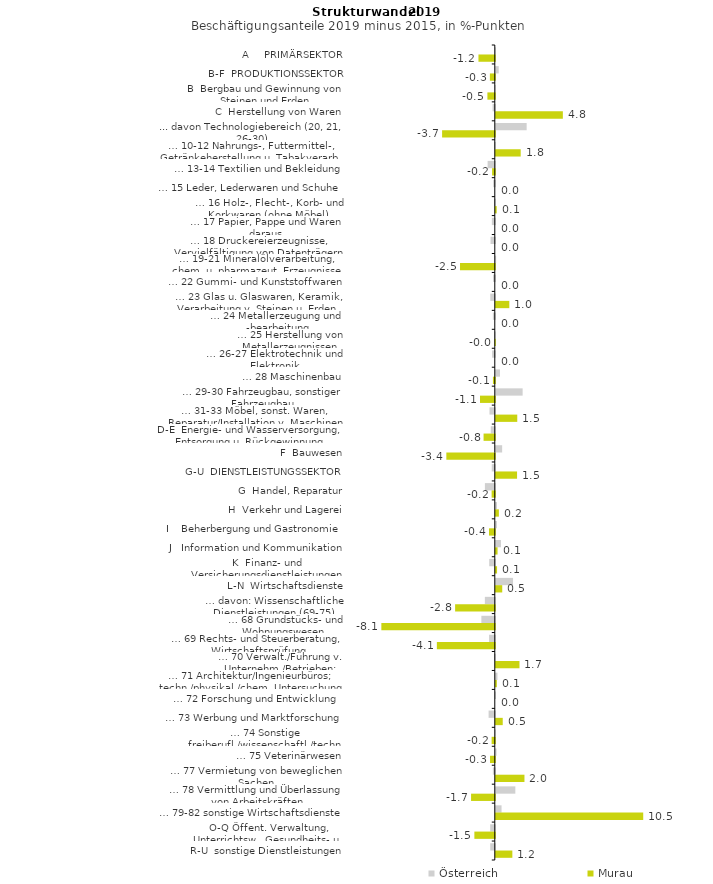
| Category | Österreich | Murau |
|---|---|---|
| A     PRIMÄRSEKTOR | 0.009 | -1.161 |
| B-F  PRODUKTIONSSEKTOR | 0.208 | -0.349 |
| B  Bergbau und Gewinnung von Steinen und Erden | -0.008 | -0.526 |
| C  Herstellung von Waren | -0.159 | 4.763 |
| ... davon Technologiebereich (20, 21, 26-30) | 2.191 | -3.743 |
| … 10-12 Nahrungs-, Futtermittel-, Getränkeherstellung u. Tabakverarb. | -0.044 | 1.769 |
| … 13-14 Textilien und Bekleidung | -0.51 | -0.192 |
| … 15 Leder, Lederwaren und Schuhe | -0.114 | 0 |
| … 16 Holz-, Flecht-, Korb- und Korkwaren (ohne Möbel)  | -0.049 | 0.064 |
| … 17 Papier, Pappe und Waren daraus  | -0.209 | 0 |
| … 18 Druckereierzeugnisse, Vervielfältigung von Datenträgern | -0.302 | 0 |
| … 19-21 Mineralölverarbeitung, chem. u. pharmazeut. Erzeugnisse | 0.022 | -2.47 |
| … 22 Gummi- und Kunststoffwaren | -0.128 | 0 |
| … 23 Glas u. Glaswaren, Keramik, Verarbeitung v. Steinen u. Erden  | -0.322 | 0.96 |
| … 24 Metallerzeugung und -bearbeitung | -0.136 | 0 |
| … 25 Herstellung von Metallerzeugnissen  | -0.032 | -0.025 |
| … 26-27 Elektrotechnik und Elektronik | -0.193 | 0 |
| … 28 Maschinenbau | 0.297 | -0.133 |
| … 29-30 Fahrzeugbau, sonstiger Fahrzeugbau | 1.906 | -1.051 |
| … 31-33 Möbel, sonst. Waren, Reparatur/Installation v. Maschinen | -0.377 | 1.524 |
| D-E  Energie- und Wasserversorgung, Entsorgung u. Rückgewinnung | -0.284 | -0.798 |
| F  Bauwesen | 0.45 | -3.441 |
| G-U  DIENSTLEISTUNGSSEKTOR | -0.217 | 1.51 |
| G  Handel, Reparatur | -0.703 | -0.226 |
| H  Verkehr und Lagerei | 0.083 | 0.218 |
| I    Beherbergung und Gastronomie | 0.078 | -0.411 |
| J   Information und Kommunikation | 0.366 | 0.124 |
| K  Finanz- und Versicherungsdienstleistungen | -0.397 | 0.09 |
| L-N  Wirtschaftsdienste | 1.224 | 0.457 |
| … davon: Wissenschaftliche Dienstleistungen (69-75) | -0.706 | -2.818 |
| … 68 Grundstücks- und Wohnungswesen  | -0.954 | -8.057 |
| … 69 Rechts- und Steuerberatung, Wirtschaftsprüfung | -0.408 | -4.115 |
| … 70 Verwalt./Führung v. Unternehm./Betrieben; Unternehmensberat. | -0.052 | 1.681 |
| … 71 Architektur/Ingenieurbüros; techn./physikal./chem. Untersuchung | 0.116 | 0.074 |
| … 72 Forschung und Entwicklung  | 0.013 | 0 |
| … 73 Werbung und Marktforschung | -0.44 | 0.493 |
| … 74 Sonstige freiberufl./wissenschaftl./techn. Tätigkeiten | 0.011 | -0.226 |
| … 75 Veterinärwesen | 0.053 | -0.339 |
| … 77 Vermietung von beweglichen Sachen  | -0.137 | 2.036 |
| … 78 Vermittlung und Überlassung von Arbeitskräften | 1.388 | -1.686 |
| … 79-82 sonstige Wirtschaftsdienste | 0.408 | 10.47 |
| O-Q Öffent. Verwaltung, Unterrichtsw., Gesundheits- u. Sozialwesen | -0.326 | -1.451 |
| R-U  sonstige Dienstleistungen | -0.326 | 1.176 |